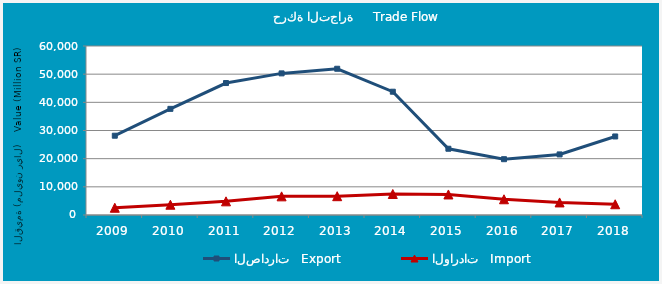
| Category | الصادرات   Export | الواردات   Import |
|---|---|---|
| 2009.0 | 28151118424 | 2569669769 |
| 2010.0 | 37685232357 | 3648764367 |
| 2011.0 | 46847798622 | 4853005979 |
| 2012.0 | 50277389034 | 6621533080 |
| 2013.0 | 51920686365 | 6674963457 |
| 2014.0 | 43770672456 | 7459547235 |
| 2015.0 | 23523615780 | 7294214562 |
| 2016.0 | 19813772303 | 5585702683 |
| 2017.0 | 21510939134 | 4464827613 |
| 2018.0 | 27880976633 | 3816275412 |